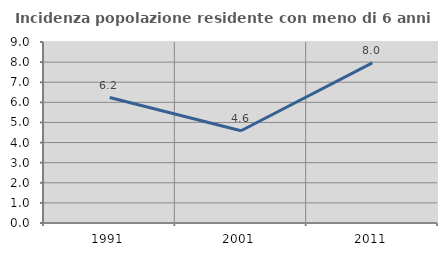
| Category | Incidenza popolazione residente con meno di 6 anni |
|---|---|
| 1991.0 | 6.237 |
| 2001.0 | 4.586 |
| 2011.0 | 7.961 |